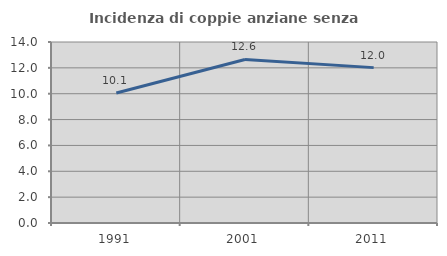
| Category | Incidenza di coppie anziane senza figli  |
|---|---|
| 1991.0 | 10.058 |
| 2001.0 | 12.647 |
| 2011.0 | 12.018 |